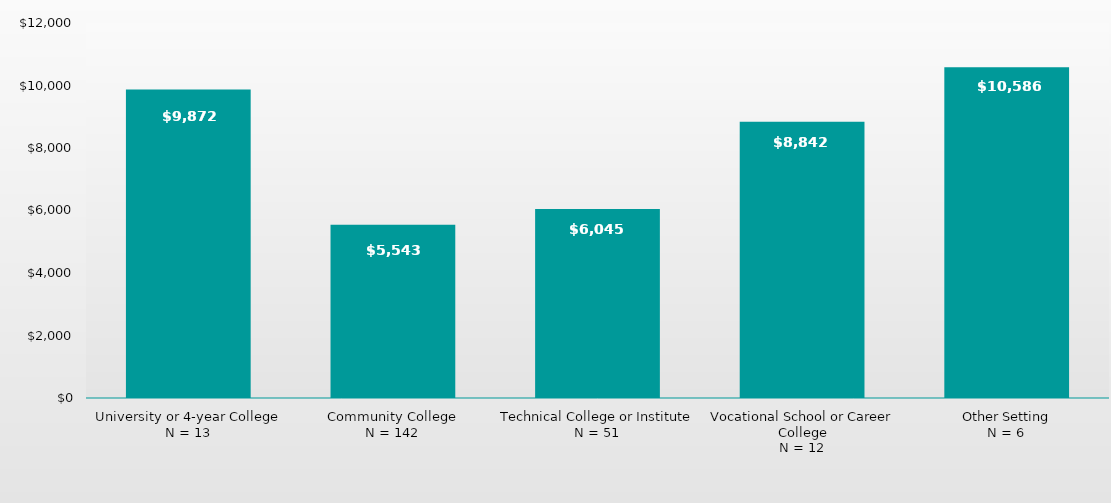
| Category | Series 0 |
|---|---|
| University or 4-year College
N = 13 | 9872 |
| Community College
N = 142 | 5543 |
| Technical College or Institute
N = 51 | 6045 |
| Vocational School or Career College
N = 12 | 8842 |
| Other Setting
N = 6 | 10586 |